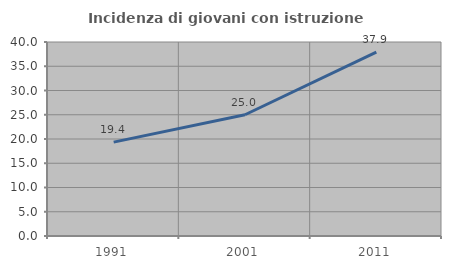
| Category | Incidenza di giovani con istruzione universitaria |
|---|---|
| 1991.0 | 19.355 |
| 2001.0 | 25 |
| 2011.0 | 37.931 |